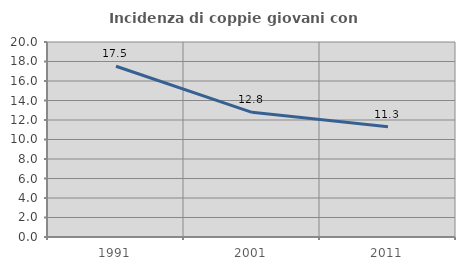
| Category | Incidenza di coppie giovani con figli |
|---|---|
| 1991.0 | 17.516 |
| 2001.0 | 12.789 |
| 2011.0 | 11.303 |